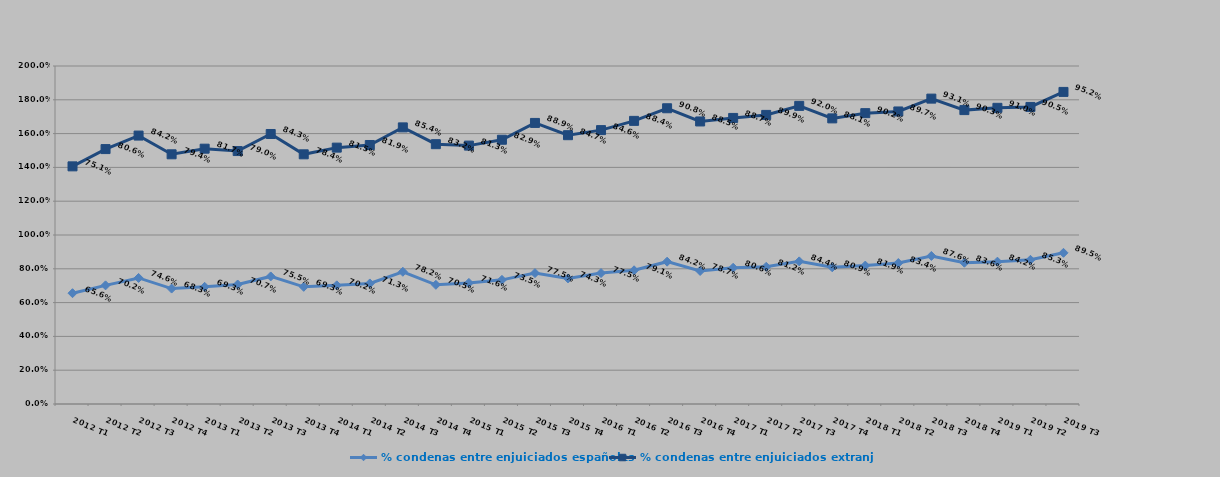
| Category | % condenas entre enjuiciados españoles | % condenas entre enjuiciados extranjeros |
|---|---|---|
| 2012 T1 | 0.656 | 0.751 |
| 2012 T2 | 0.702 | 0.806 |
| 2012 T3 | 0.746 | 0.842 |
| 2012 T4 | 0.683 | 0.794 |
| 2013 T1 | 0.693 | 0.817 |
| 2013 T2 | 0.707 | 0.79 |
| 2013 T3 | 0.755 | 0.843 |
| 2013 T4 | 0.693 | 0.784 |
| 2014 T1 | 0.702 | 0.815 |
| 2014 T2 | 0.713 | 0.819 |
| 2014 T3 | 0.782 | 0.854 |
| 2014 T4 | 0.705 | 0.832 |
| 2015 T1 | 0.716 | 0.812 |
| 2015 T2 | 0.735 | 0.829 |
| 2015 T3 | 0.775 | 0.889 |
| 2015 T4 | 0.743 | 0.847 |
| 2016 T1 | 0.775 | 0.846 |
| 2016 T2 | 0.791 | 0.884 |
| 2016 T3 | 0.842 | 0.908 |
| 2016 T4 | 0.787 | 0.885 |
| 2017 T1 | 0.806 | 0.887 |
| 2017 T2 | 0.812 | 0.899 |
| 2017 T3 | 0.844 | 0.92 |
| 2017 T4 | 0.809 | 0.881 |
| 2018 T1 | 0.819 | 0.902 |
| 2018 T2 | 0.834 | 0.897 |
| 2018 T3 | 0.876 | 0.931 |
| 2018 T4 | 0.836 | 0.903 |
| 2019 T1 | 0.842 | 0.91 |
| 2019 T2 | 0.853 | 0.905 |
| 2019 T3 | 0.895 | 0.952 |